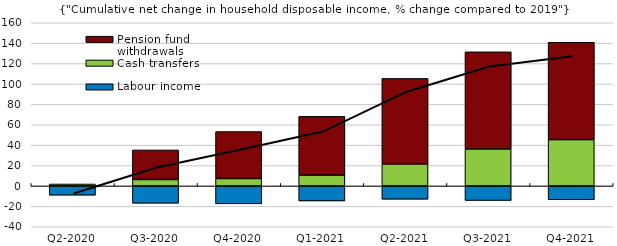
| Category | Labour income | Cash transfers | Pension fund withdrawals |
|---|---|---|---|
| Q2-2020 | -9.054 | 1.93 | 0 |
| Q3-2020 | -16.95 | 6.332 | 29.013 |
| Q4-2020 | -17.534 | 7.292 | 46.051 |
| Q1-2021 | -14.688 | 10.608 | 57.66 |
| Q2-2021 | -13.034 | 21.543 | 83.914 |
| Q3-2021 | -14.25 | 36.273 | 95.253 |
| Q4-2021 | -13.511 | 45.436 | 95.491 |